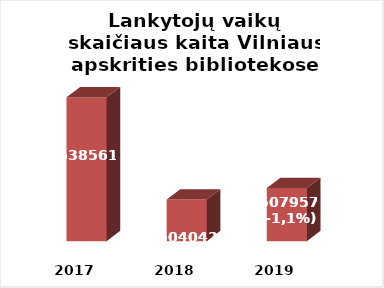
| Category | Series 0 |
|---|---|
| 2017.0 | 538561 |
| 2018.0 | 504042 |
| 2019.0 | 507957 |